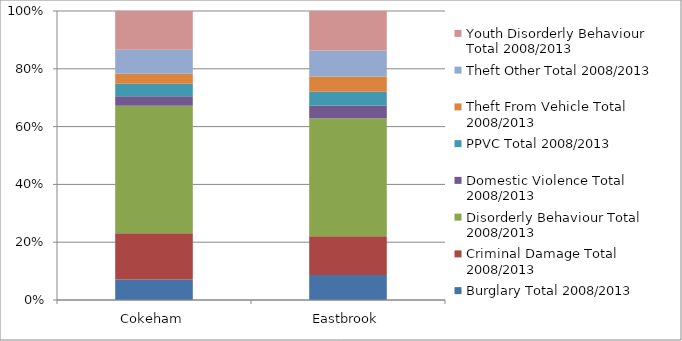
| Category | Burglary Total 2008/2013 | Criminal Damage Total 2008/2013 | Disorderly Behaviour Total 2008/2013 | Domestic Violence Total 2008/2013 | PPVC Total 2008/2013 | Theft From Vehicle Total 2008/2013 | Theft Other Total 2008/2013 | Youth Disorderly Behaviour Total 2008/2013 |
|---|---|---|---|---|---|---|---|---|
| Cokeham | 106 | 240 | 660 | 49 | 65 | 51 | 125 | 200 |
| Eastbrook | 214 | 332 | 1010 | 110 | 118 | 129 | 224 | 338 |